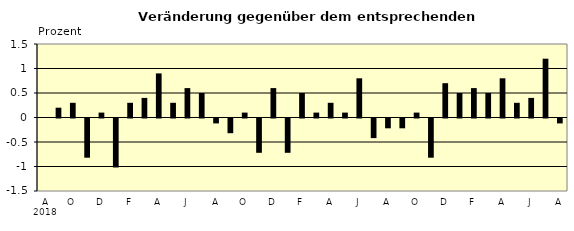
| Category | Series 0 |
|---|---|
| 0 | 0 |
| 1 | 0.2 |
| 2 | 0.3 |
| 3 | -0.8 |
| 4 | 0.1 |
| 5 | -1 |
| 6 | 0.3 |
| 7 | 0.4 |
| 8 | 0.9 |
| 9 | 0.3 |
| 10 | 0.6 |
| 11 | 0.5 |
| 12 | -0.1 |
| 13 | -0.3 |
| 14 | 0.1 |
| 15 | -0.7 |
| 16 | 0.6 |
| 17 | -0.7 |
| 18 | 0.5 |
| 19 | 0.1 |
| 20 | 0.3 |
| 21 | 0.1 |
| 22 | 0.8 |
| 23 | -0.4 |
| 24 | -0.2 |
| 25 | -0.2 |
| 26 | 0.1 |
| 27 | -0.8 |
| 28 | 0.7 |
| 29 | 0.5 |
| 30 | 0.6 |
| 31 | 0.5 |
| 32 | 0.8 |
| 33 | 0.3 |
| 34 | 0.4 |
| 35 | 1.2 |
| 36 | -0.1 |